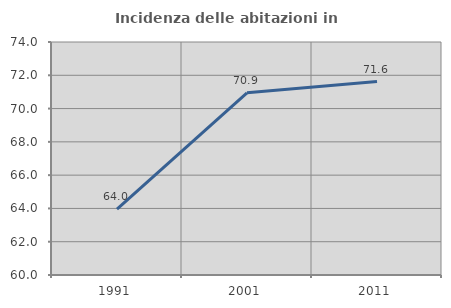
| Category | Incidenza delle abitazioni in proprietà  |
|---|---|
| 1991.0 | 63.957 |
| 2001.0 | 70.945 |
| 2011.0 | 71.623 |